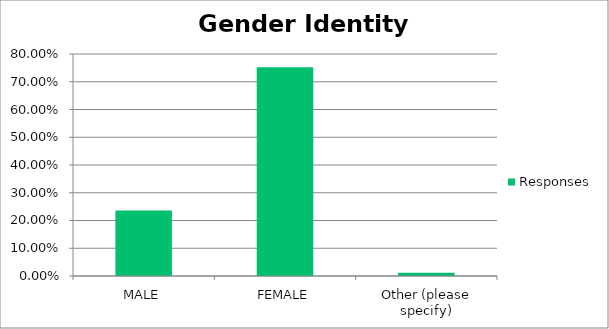
| Category | Responses |
|---|---|
| MALE | 0.236 |
| FEMALE | 0.753 |
| Other (please specify) | 0.012 |